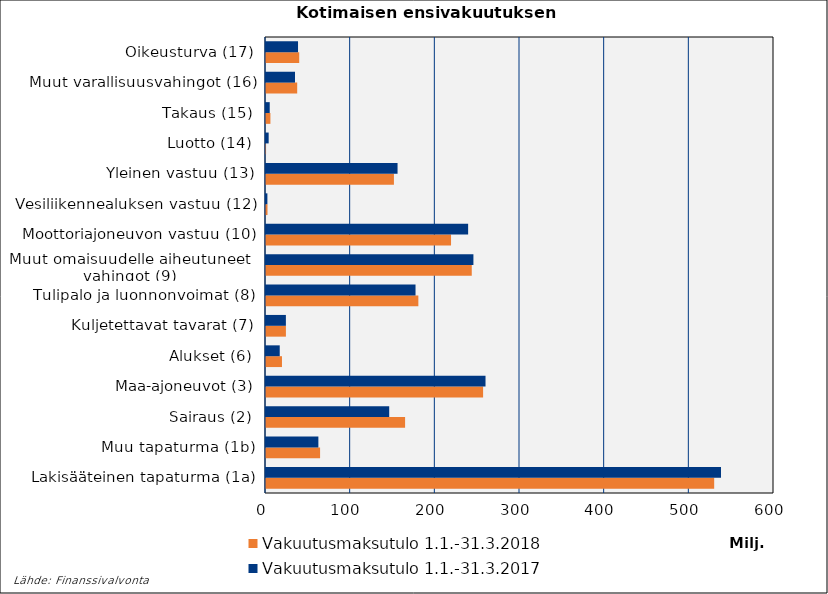
| Category | Vakuutusmaksutulo |
|---|---|
| Lakisääteinen tapaturma (1a) | 537398.608 |
| Muu tapaturma (1b) | 61862.08 |
| Sairaus (2) | 145526.784 |
| Maa-ajoneuvot (3) | 259271.828 |
| Alukset (6) | 16217.581 |
| Kuljetettavat tavarat (7) | 23485.322 |
| Tulipalo ja luonnonvoimat (8) | 176606.004 |
| Muut omaisuudelle aiheutuneet 
vahingot (9) | 244979.63 |
| Moottoriajoneuvon vastuu (10) | 238735.31 |
| Vesiliikennealuksen vastuu (12) | 1644.077 |
| Yleinen vastuu (13) | 155376.778 |
| Luotto (14) | 3142.394 |
| Takaus (15) | 4396.295 |
| Muut varallisuusvahingot (16) | 34254.66 |
| Oikeusturva (17) | 37830.226 |